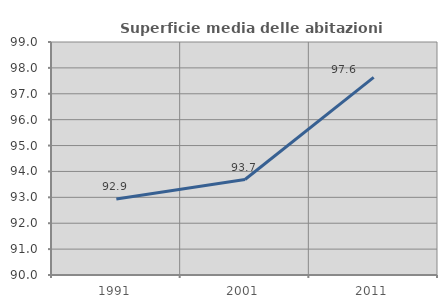
| Category | Superficie media delle abitazioni occupate |
|---|---|
| 1991.0 | 92.932 |
| 2001.0 | 93.687 |
| 2011.0 | 97.632 |